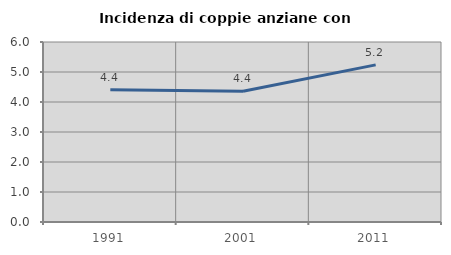
| Category | Incidenza di coppie anziane con figli |
|---|---|
| 1991.0 | 4.406 |
| 2001.0 | 4.361 |
| 2011.0 | 5.238 |